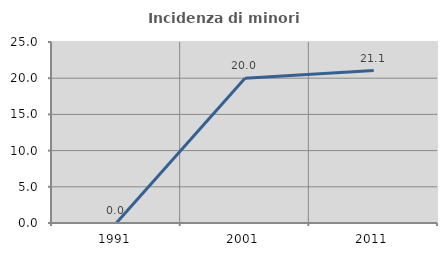
| Category | Incidenza di minori stranieri |
|---|---|
| 1991.0 | 0 |
| 2001.0 | 20 |
| 2011.0 | 21.053 |